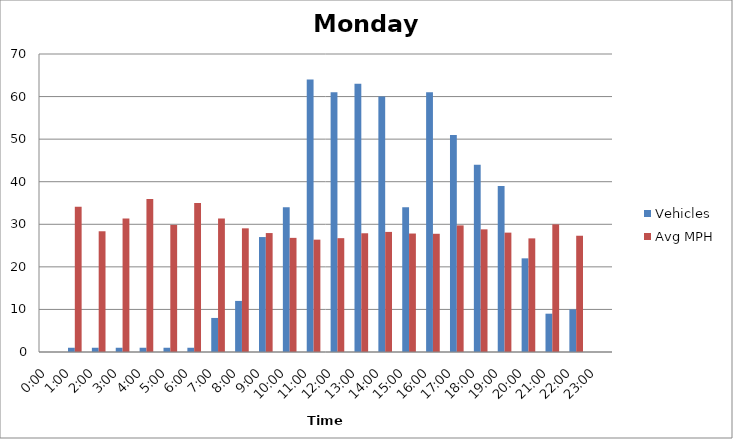
| Category | Vehicles | Avg MPH |
|---|---|---|
| 0:00 | 0 | 0 |
| 1:00 | 1 | 34.12 |
| 2:00 | 1 | 28.36 |
| 3:00 | 1 | 31.36 |
| 4:00 | 1 | 35.96 |
| 5:00 | 1 | 29.85 |
| 6:00 | 1 | 34.99 |
| 7:00 | 8 | 31.35 |
| 8:00 | 12 | 29.05 |
| 9:00 | 27 | 27.94 |
| 10:00 | 34 | 26.81 |
| 11:00 | 64 | 26.39 |
| 12:00 | 61 | 26.74 |
| 13:00 | 63 | 27.89 |
| 14:00 | 60 | 28.21 |
| 15:00 | 34 | 27.83 |
| 16:00 | 61 | 27.77 |
| 17:00 | 51 | 29.74 |
| 18:00 | 44 | 28.81 |
| 19:00 | 39 | 28.04 |
| 20:00 | 22 | 26.69 |
| 21:00 | 9 | 29.98 |
| 22:00 | 10 | 27.31 |
| 23:00 | 0 | 0 |